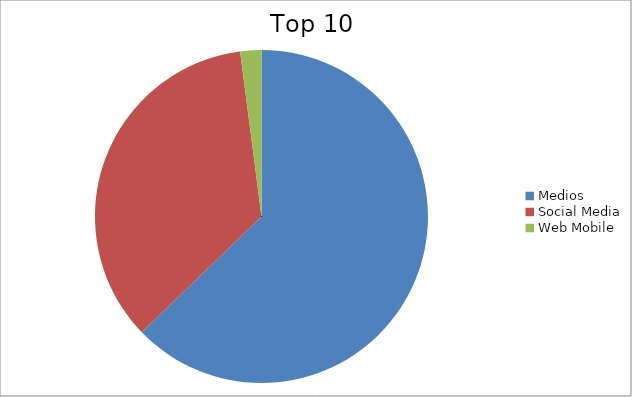
| Category | Series 0 |
|---|---|
| Medios | 62.78 |
| Social Media | 35.17 |
| Web Mobile | 2.05 |